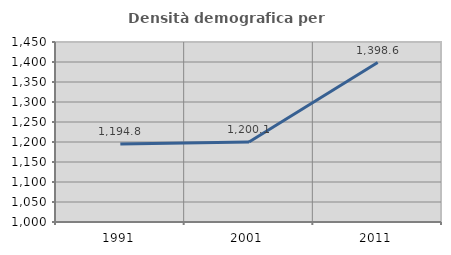
| Category | Densità demografica |
|---|---|
| 1991.0 | 1194.793 |
| 2001.0 | 1200.092 |
| 2011.0 | 1398.572 |